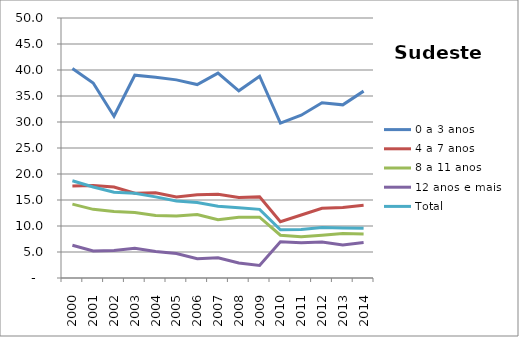
| Category | 0 a 3 anos | 4 a 7 anos | 8 a 11 anos | 12 anos e mais | Total |
|---|---|---|---|---|---|
| 2000.0 | 40.3 | 17.7 | 14.2 | 6.3 | 18.7 |
| 2001.0 | 37.5 | 17.8 | 13.2 | 5.2 | 17.5 |
| 2002.0 | 31.1 | 17.5 | 12.8 | 5.3 | 16.5 |
| 2003.0 | 39 | 16.3 | 12.6 | 5.7 | 16.3 |
| 2004.0 | 38.6 | 16.4 | 12 | 5.1 | 15.6 |
| 2005.0 | 38.1 | 15.6 | 11.9 | 4.7 | 14.8 |
| 2006.0 | 37.2 | 16 | 12.2 | 3.7 | 14.5 |
| 2007.0 | 39.4 | 16.1 | 11.2 | 3.9 | 13.8 |
| 2008.0 | 36 | 15.5 | 11.7 | 2.9 | 13.5 |
| 2009.0 | 38.8 | 15.6 | 11.7 | 2.4 | 13.2 |
| 2010.0 | 29.785 | 10.821 | 8.226 | 6.95 | 9.278 |
| 2011.0 | 31.302 | 12.112 | 7.943 | 6.794 | 9.345 |
| 2012.0 | 33.69 | 13.397 | 8.235 | 6.909 | 9.695 |
| 2013.0 | 33.299 | 13.579 | 8.569 | 6.362 | 9.61 |
| 2014.0 | 35.937 | 13.988 | 8.467 | 6.825 | 9.562 |